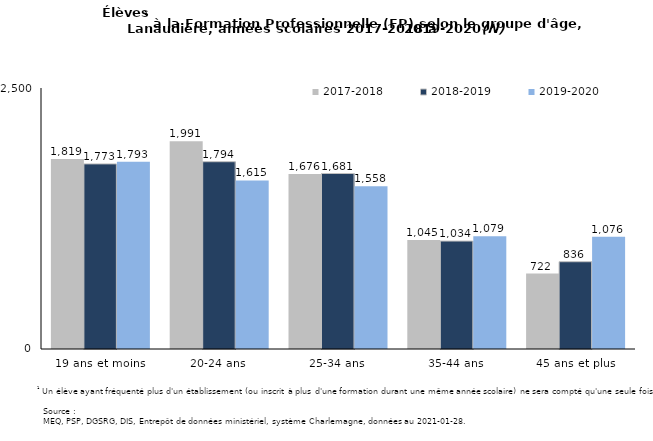
| Category | 2017-2018 | 2018-2019 | 2019-2020 |
|---|---|---|---|
| 19 ans et moins | 1819 | 1773 | 1793 |
| 20-24 ans | 1991 | 1794 | 1615 |
| 25-34 ans | 1676 | 1681 | 1558 |
| 35-44 ans | 1045 | 1034 | 1079 |
| 45 ans et plus | 722 | 836 | 1076 |